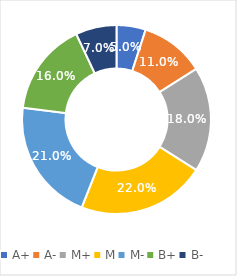
| Category | Series 0 |
|---|---|
| A+ | 0.05 |
| A- | 0.11 |
| M+ | 0.18 |
| M | 0.22 |
| M- | 0.21 |
| B+ | 0.16 |
| B- | 0.07 |